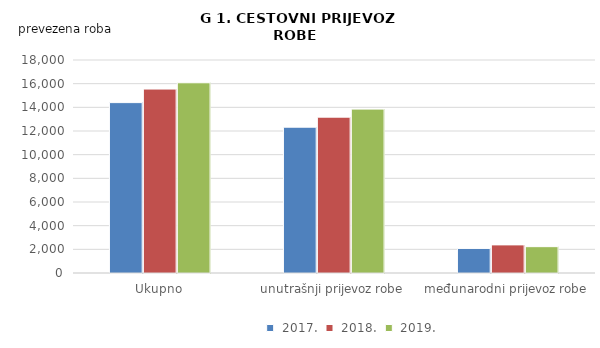
| Category |  2017. |  2018. |  2019. |
|---|---|---|---|
| Ukupno | 14398 | 15545 | 16076 |
| unutrašnji prijevoz robe | 12321 | 13169 | 13850 |
| međunarodni prijevoz robe | 2077 | 2376 | 2226 |